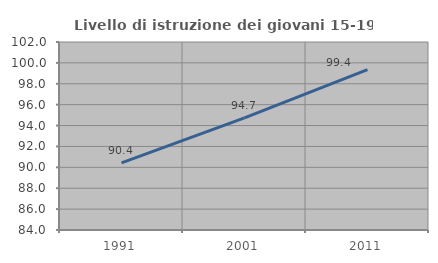
| Category | Livello di istruzione dei giovani 15-19 anni |
|---|---|
| 1991.0 | 90.431 |
| 2001.0 | 94.737 |
| 2011.0 | 99.359 |